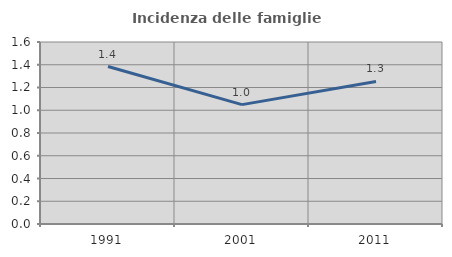
| Category | Incidenza delle famiglie numerose |
|---|---|
| 1991.0 | 1.384 |
| 2001.0 | 1.049 |
| 2011.0 | 1.253 |